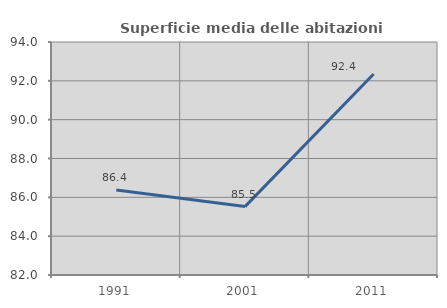
| Category | Superficie media delle abitazioni occupate |
|---|---|
| 1991.0 | 86.379 |
| 2001.0 | 85.522 |
| 2011.0 | 92.35 |